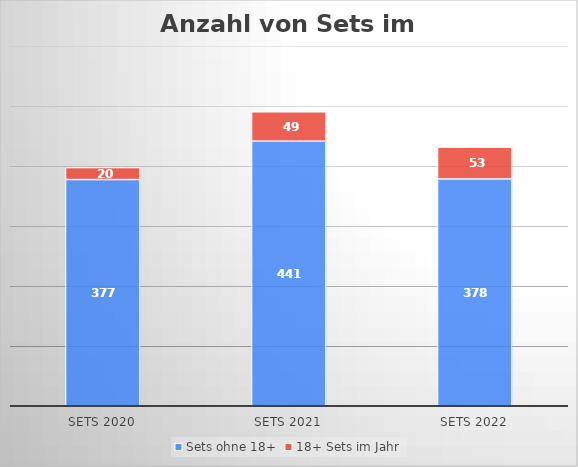
| Category | Sets ohne 18+ | 18+ Sets im Jahr |
|---|---|---|
| Sets 2020 | 377 | 20 |
| Sets 2021 | 441 | 49 |
| Sets 2022 | 378 | 53 |